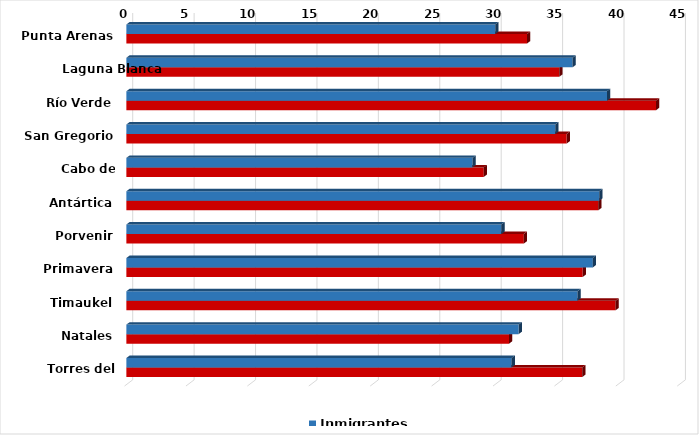
| Category | Inmigrantes | Emigrantes |
|---|---|---|
| Punta Arenas | 30.031 | 32.62 |
| Laguna Blanca | 36.326 | 35.239 |
| Río Verde | 39.138 | 43.123 |
| San Gregorio | 34.916 | 35.848 |
| Cabo de Hornos | 28.184 | 29.099 |
| Antártica | 38.506 | 38.426 |
| Porvenir | 30.531 | 32.359 |
| Primavera | 37.978 | 37.153 |
| Timaukel | 36.736 | 39.831 |
| Natales | 31.94 | 31.159 |
| Torres del Paine | 31.366 | 37.121 |